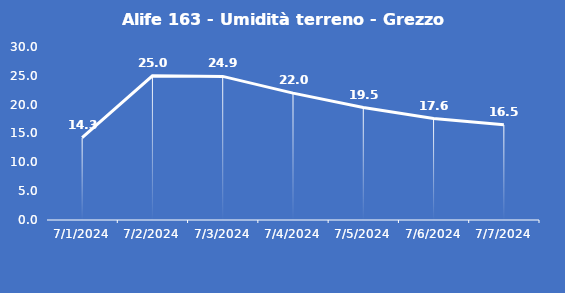
| Category | Alife 163 - Umidità terreno - Grezzo (%VWC) |
|---|---|
| 7/1/24 | 14.3 |
| 7/2/24 | 25 |
| 7/3/24 | 24.9 |
| 7/4/24 | 22 |
| 7/5/24 | 19.5 |
| 7/6/24 | 17.6 |
| 7/7/24 | 16.5 |